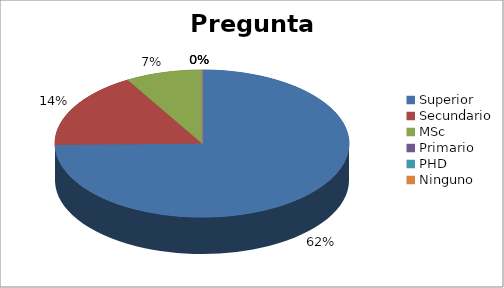
| Category | Series 0 |
|---|---|
| Superior | 0.62 |
| Secundario | 0.14 |
| MSc | 0.07 |
| Primario | 0 |
| PHD | 0 |
| Ninguno | 0 |